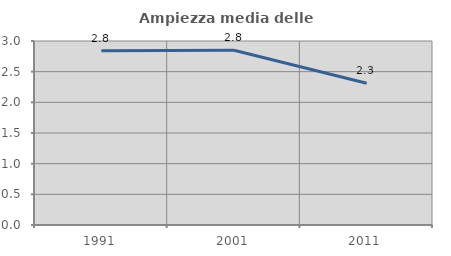
| Category | Ampiezza media delle famiglie |
|---|---|
| 1991.0 | 2.841 |
| 2001.0 | 2.849 |
| 2011.0 | 2.31 |